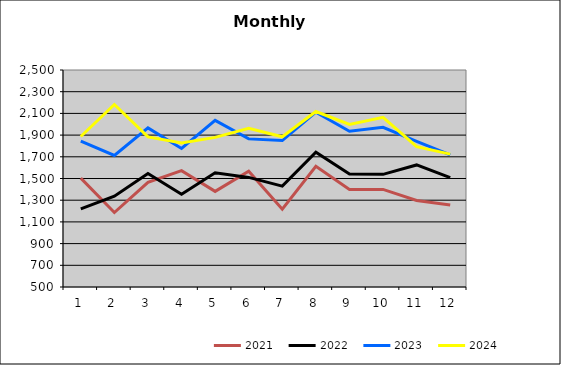
| Category | 2021 | 2022 | 2023 | 2024 |
|---|---|---|---|---|
| 0 | 1503.68 | 1219.945 | 1844.318 | 1887.12 |
| 1 | 1186.293 | 1336.681 | 1712.41 | 2182.42 |
| 2 | 1464.516 | 1545.46 | 1966.844 | 1883.802 |
| 3 | 1572.076 | 1354.89 | 1776.83 | 1826.456 |
| 4 | 1381.3 | 1552.185 | 2036.149 | 1879.077 |
| 5 | 1567.527 | 1510.185 | 1865.135 | 1962.376 |
| 6 | 1216.971 | 1429.988 | 1849.967 | 1884.713 |
| 7 | 1613.137 | 1742.939 | 2111.02 | 2117.589 |
| 8 | 1398.947 | 1540.494 | 1935.176 | 1997.536 |
| 9 | 1399.401 | 1538.281 | 1971.471 | 2063.568 |
| 10 | 1297.013 | 1625.039 | 1842.128 | 1793.763 |
| 11 | 1256.018 | 1508.631 | 1716.881 | 1724.332 |